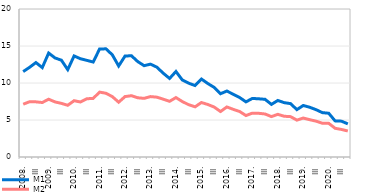
| Category | M1 | M2 |
|---|---|---|
| 2008. | 11.541 | 7.133 |
| II | 12.117 | 7.468 |
| III | 12.759 | 7.452 |
| IV | 12.081 | 7.363 |
| 2009. | 14.049 | 7.807 |
| II | 13.385 | 7.444 |
| III | 13.083 | 7.248 |
| IV | 11.81 | 6.988 |
| 2010. | 13.656 | 7.609 |
| II | 13.277 | 7.434 |
| III | 13.06 | 7.871 |
| IV | 12.834 | 7.919 |
| 2011. | 14.592 | 8.771 |
| II | 14.618 | 8.614 |
| III | 13.812 | 8.163 |
| IV | 12.299 | 7.403 |
| 2012. | 13.639 | 8.164 |
| II | 13.689 | 8.283 |
| III | 12.893 | 8.004 |
| IV | 12.342 | 7.926 |
| 2013. | 12.547 | 8.164 |
| II | 12.14 | 8.086 |
| III | 11.324 | 7.815 |
| IV | 10.614 | 7.526 |
| 2014. | 11.557 | 8.031 |
| II | 10.403 | 7.493 |
| III | 9.972 | 7.067 |
| IV | 9.656 | 6.777 |
| 2015. | 10.539 | 7.363 |
| II | 9.933 | 7.097 |
| III | 9.408 | 6.752 |
| IV | 8.554 | 6.143 |
| 2016. | 8.914 | 6.764 |
| II | 8.476 | 6.441 |
| III | 8.039 | 6.151 |
| IV | 7.449 | 5.602 |
| 2017. | 7.914 | 5.927 |
| II | 7.864 | 5.906 |
| III | 7.796 | 5.812 |
| IV | 7.109 | 5.459 |
| 2018. | 7.639 | 5.765 |
| II | 7.345 | 5.506 |
| III | 7.214 | 5.455 |
| IV | 6.403 | 4.984 |
| 2019. | 6.962 | 5.26 |
| II | 6.724 | 5.045 |
| III | 6.399 | 4.846 |
| IV | 5.996 | 4.566 |
| 2020. | 5.913 | 4.555 |
| II | 4.881 | 3.881 |
| III | 4.844 | 3.723 |
| IV | 4.478 | 3.516 |